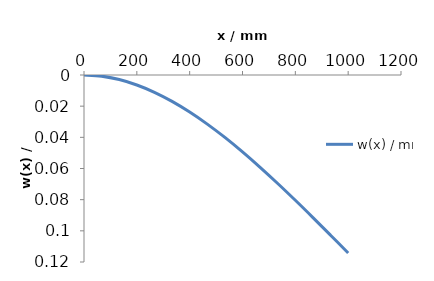
| Category | w(x) / mm |
|---|---|
| 0.0 | 0 |
| 66.66666666666667 | 0.001 |
| 133.33333333333334 | 0.003 |
| 200.0 | 0.006 |
| 266.6666666666667 | 0.011 |
| 333.3333333333333 | 0.017 |
| 400.0 | 0.024 |
| 466.6666666666667 | 0.032 |
| 533.3333333333334 | 0.04 |
| 600.0 | 0.049 |
| 666.6666666666666 | 0.059 |
| 733.3333333333333 | 0.07 |
| 800.0 | 0.08 |
| 866.6666666666667 | 0.091 |
| 933.3333333333334 | 0.103 |
| 1000.0 | 0.114 |